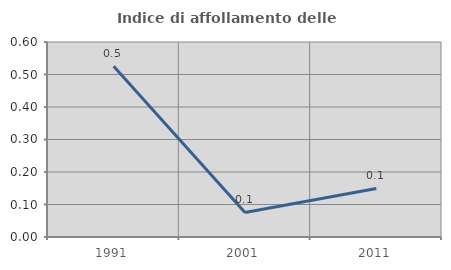
| Category | Indice di affollamento delle abitazioni  |
|---|---|
| 1991.0 | 0.526 |
| 2001.0 | 0.075 |
| 2011.0 | 0.149 |